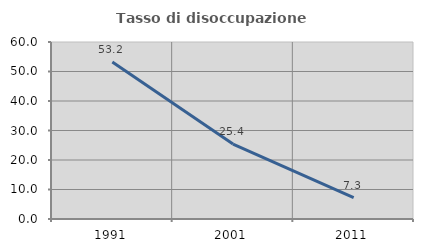
| Category | Tasso di disoccupazione giovanile  |
|---|---|
| 1991.0 | 53.199 |
| 2001.0 | 25.41 |
| 2011.0 | 7.273 |